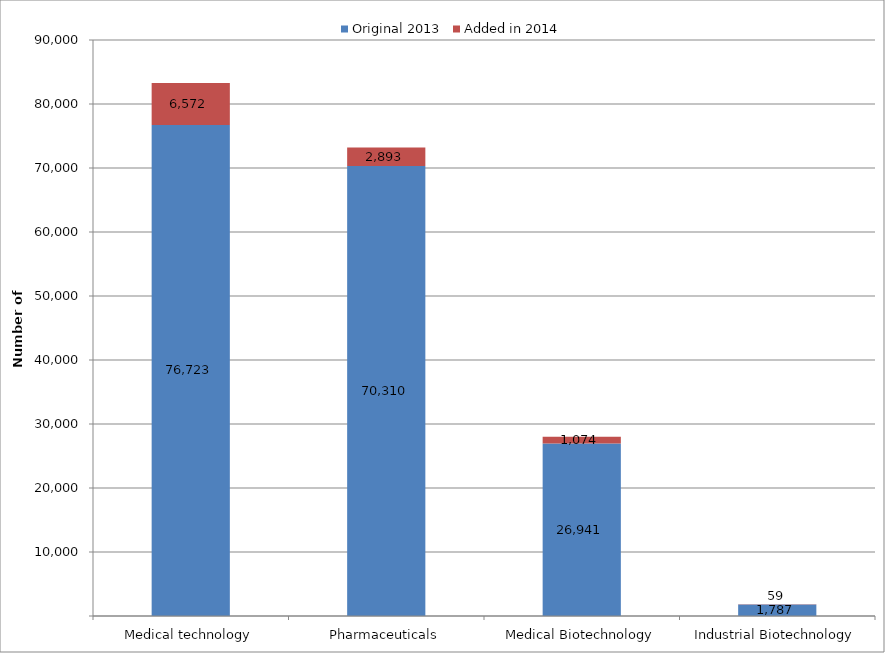
| Category | Original 2013 | Added in 2014 |
|---|---|---|
| Medical technology | 76723 | 6572.3 |
| Pharmaceuticals | 70310 | 2892.8 |
| Medical Biotechnology | 26941 | 1074.4 |
| Industrial Biotechnology | 1787 | 59.1 |